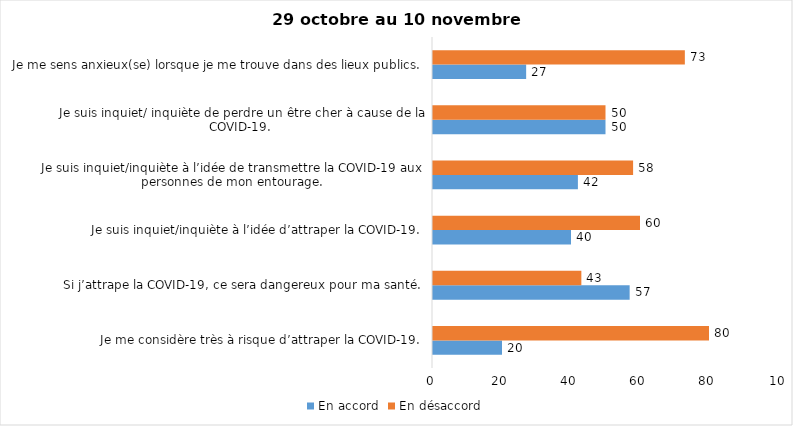
| Category | En accord | En désaccord |
|---|---|---|
| Je me considère très à risque d’attraper la COVID-19. | 20 | 80 |
| Si j’attrape la COVID-19, ce sera dangereux pour ma santé. | 57 | 43 |
| Je suis inquiet/inquiète à l’idée d’attraper la COVID-19. | 40 | 60 |
| Je suis inquiet/inquiète à l’idée de transmettre la COVID-19 aux personnes de mon entourage. | 42 | 58 |
| Je suis inquiet/ inquiète de perdre un être cher à cause de la COVID-19. | 50 | 50 |
| Je me sens anxieux(se) lorsque je me trouve dans des lieux publics. | 27 | 73 |